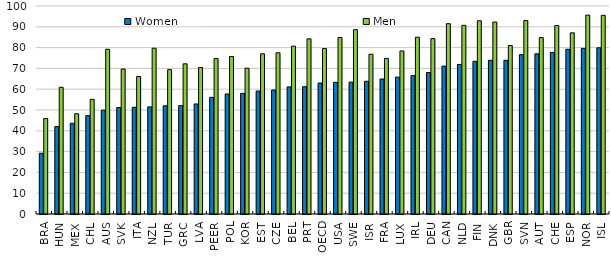
| Category | Women | Men |
|---|---|---|
| BRA | 29.2 | 45.9 |
| HUN | 42 | 60.9 |
| MEX | 43.6 | 48.2 |
| CHL | 47.3 | 55.1 |
| AUS | 49.9 | 79.2 |
| SVK | 51.2 | 69.7 |
| ITA | 51.3 | 66.1 |
| NZL | 51.5 | 79.7 |
| TUR | 52 | 69.4 |
| GRC | 52.1 | 72.2 |
| LVA | 52.9 | 70.4 |
| PEER | 56.089 | 74.722 |
| POL | 57.7 | 75.7 |
| KOR | 58 | 70.1 |
| EST | 59.1 | 77 |
| CZE | 59.6 | 77.5 |
| BEL | 61.1 | 80.7 |
| PRT | 61.2 | 84.2 |
| OECD | 62.953 | 79.526 |
| USA | 63.3 | 84.9 |
| SWE | 63.4 | 88.6 |
| ISR | 63.8 | 76.8 |
| FRA | 64.9 | 74.8 |
| LUX | 65.8 | 78.4 |
| IRL | 66.5 | 85 |
| DEU | 68 | 84.3 |
| CAN | 71.1 | 91.5 |
| NLD | 71.9 | 90.7 |
| FIN | 73.4 | 92.9 |
| DNK | 73.9 | 92.3 |
| GBR | 73.9 | 81 |
| SVN | 76.6 | 93 |
| AUT | 77 | 84.8 |
| CHE | 77.7 | 90.6 |
| ESP | 79.2 | 87.1 |
| NOR | 79.6 | 95.6 |
| ISL | 79.9 | 95.5 |